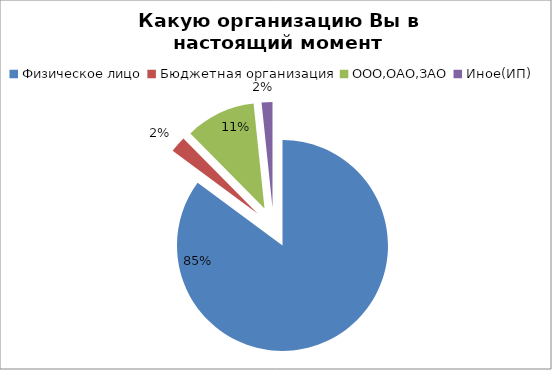
| Category | Какую организацию Вы в настоящий момент представляете? |
|---|---|
| Физическое лицо | 103 |
| Бюджетная организация | 3 |
| ООО,ОАО,ЗАО | 13 |
| Иное(ИП) | 2 |